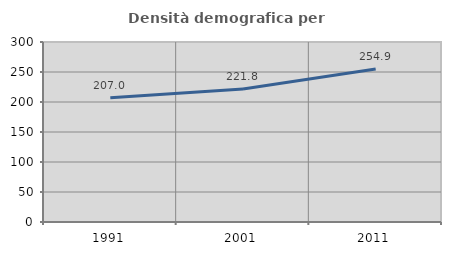
| Category | Densità demografica |
|---|---|
| 1991.0 | 207.024 |
| 2001.0 | 221.821 |
| 2011.0 | 254.884 |